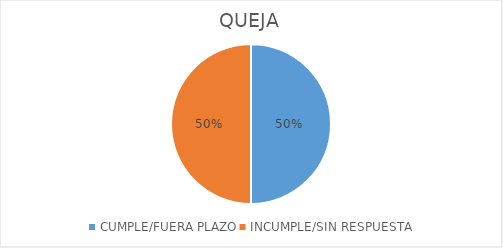
| Category | Series 0 |
|---|---|
| CUMPLE/FUERA PLAZO | 1 |
| INCUMPLE/SIN RESPUESTA | 1 |